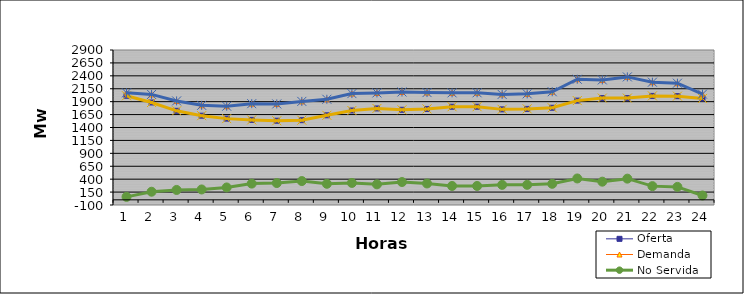
| Category | Oferta | Demanda | No Servida |
|---|---|---|---|
| 1.0 | 2013.63 | 2070.83 | 57.2 |
| 2.0 | 1884 | 2040.61 | 156.61 |
| 3.0 | 1723.07 | 1914.35 | 191.28 |
| 4.0 | 1628.4 | 1829.18 | 200.78 |
| 5.0 | 1571.77 | 1811.46 | 239.69 |
| 6.0 | 1547.12 | 1860.91 | 313.79 |
| 7.0 | 1530.95 | 1855.75 | 324.8 |
| 8.0 | 1541.69 | 1904.96 | 363.27 |
| 9.0 | 1636 | 1946.36 | 310.36 |
| 10.0 | 1729.13 | 2056.37 | 327.24 |
| 11.0 | 1768.99 | 2068.76 | 299.77 |
| 12.0 | 1742.88 | 2087.55 | 344.67 |
| 13.0 | 1759.1 | 2075.61 | 316.51 |
| 14.0 | 1802.09 | 2070.73 | 268.64 |
| 15.0 | 1802.82 | 2071.64 | 268.82 |
| 16.0 | 1750.89 | 2040.57 | 289.68 |
| 17.0 | 1760.4 | 2051.15 | 290.75 |
| 18.0 | 1782.21 | 2092.26 | 310.05 |
| 19.0 | 1920.54 | 2334.01 | 413.47 |
| 20.0 | 1969.2 | 2320.59 | 351.39 |
| 21.0 | 1969.32 | 2379.26 | 409.94 |
| 22.0 | 2011.72 | 2276.96 | 265.24 |
| 23.0 | 2006.73 | 2257.1 | 250.37 |
| 24.0 | 1961.99 | 2046.24 | 84.25 |